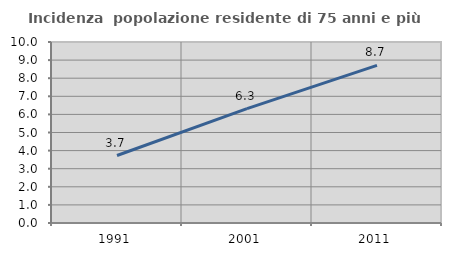
| Category | Incidenza  popolazione residente di 75 anni e più |
|---|---|
| 1991.0 | 3.729 |
| 2001.0 | 6.323 |
| 2011.0 | 8.708 |